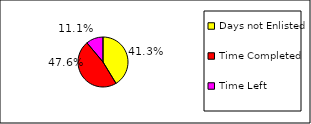
| Category | Series 0 |
|---|---|
| Days not Enlisted | 8275 |
| Time Completed | 9532.755 |
| Time Left | -2226.755 |